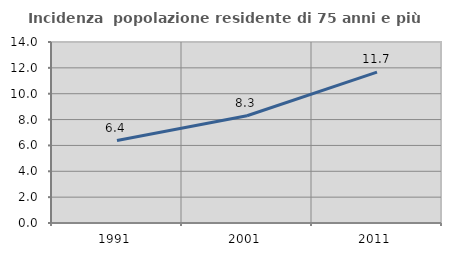
| Category | Incidenza  popolazione residente di 75 anni e più |
|---|---|
| 1991.0 | 6.377 |
| 2001.0 | 8.299 |
| 2011.0 | 11.665 |